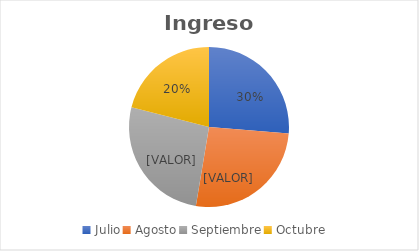
| Category | Series 0 |
|---|---|
| Julio | 1 |
| Agosto | 1 |
| Septiembre | 1 |
| Octubre | 0.8 |